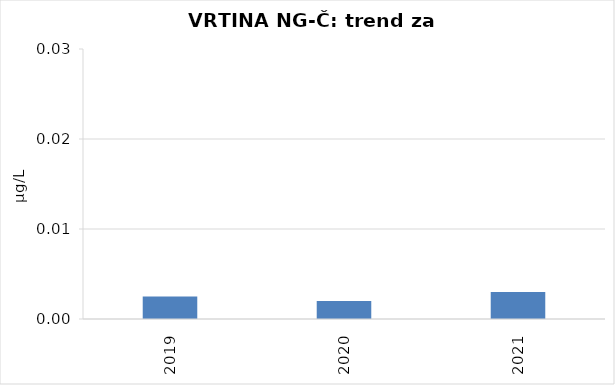
| Category | Vsota |
|---|---|
| 2019 | 0.002 |
| 2020 | 0.002 |
| 2021 | 0.003 |